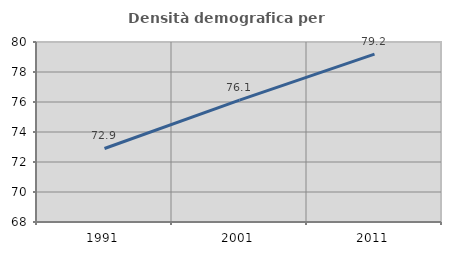
| Category | Densità demografica |
|---|---|
| 1991.0 | 72.902 |
| 2001.0 | 76.122 |
| 2011.0 | 79.191 |